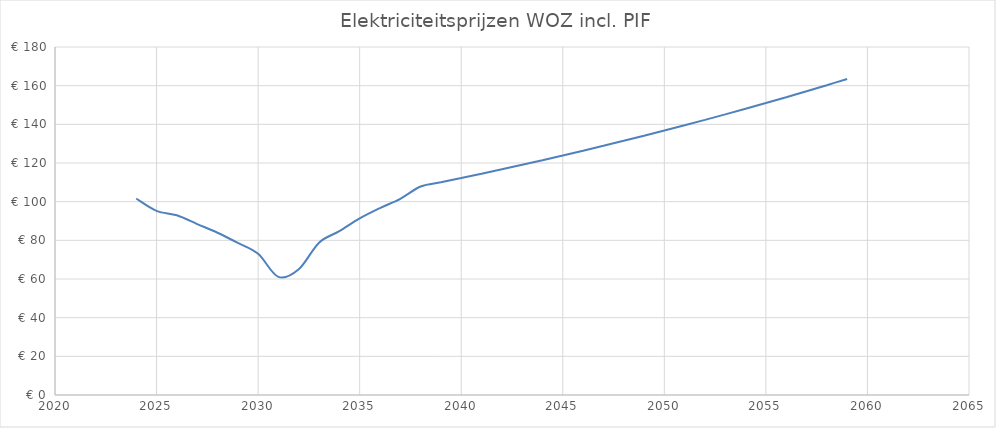
| Category | Series 0 |
|---|---|
| 2024.0 | 101.629 |
| 2025.0 | 95.26 |
| 2026.0 | 92.94 |
| 2027.0 | 88.411 |
| 2028.0 | 83.916 |
| 2029.0 | 78.667 |
| 2030.0 | 73.014 |
| 2031.0 | 61.084 |
| 2032.0 | 65.017 |
| 2033.0 | 78.803 |
| 2034.0 | 84.738 |
| 2035.0 | 91.313 |
| 2036.0 | 96.675 |
| 2037.0 | 101.467 |
| 2038.0 | 107.844 |
| 2039.0 | 110.001 |
| 2040.0 | 112.201 |
| 2041.0 | 114.445 |
| 2042.0 | 116.734 |
| 2043.0 | 119.069 |
| 2044.0 | 121.45 |
| 2045.0 | 123.879 |
| 2046.0 | 126.357 |
| 2047.0 | 128.884 |
| 2048.0 | 131.462 |
| 2049.0 | 134.091 |
| 2050.0 | 136.773 |
| 2051.0 | 139.508 |
| 2052.0 | 142.298 |
| 2053.0 | 145.144 |
| 2054.0 | 148.047 |
| 2055.0 | 151.008 |
| 2056.0 | 154.028 |
| 2057.0 | 157.109 |
| 2058.0 | 160.251 |
| 2059.0 | 163.456 |